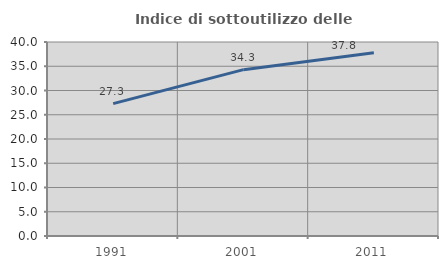
| Category | Indice di sottoutilizzo delle abitazioni  |
|---|---|
| 1991.0 | 27.304 |
| 2001.0 | 34.298 |
| 2011.0 | 37.781 |